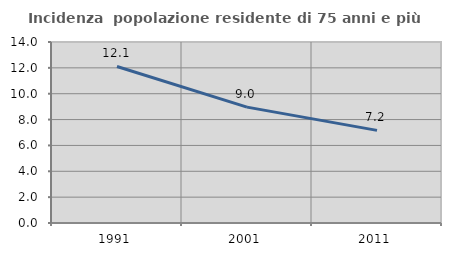
| Category | Incidenza  popolazione residente di 75 anni e più |
|---|---|
| 1991.0 | 12.105 |
| 2001.0 | 8.964 |
| 2011.0 | 7.165 |